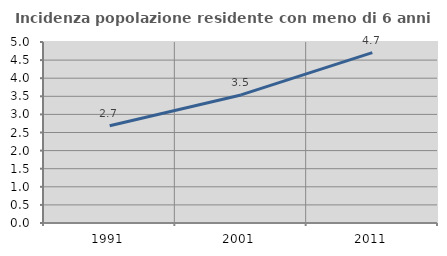
| Category | Incidenza popolazione residente con meno di 6 anni |
|---|---|
| 1991.0 | 2.685 |
| 2001.0 | 3.538 |
| 2011.0 | 4.706 |